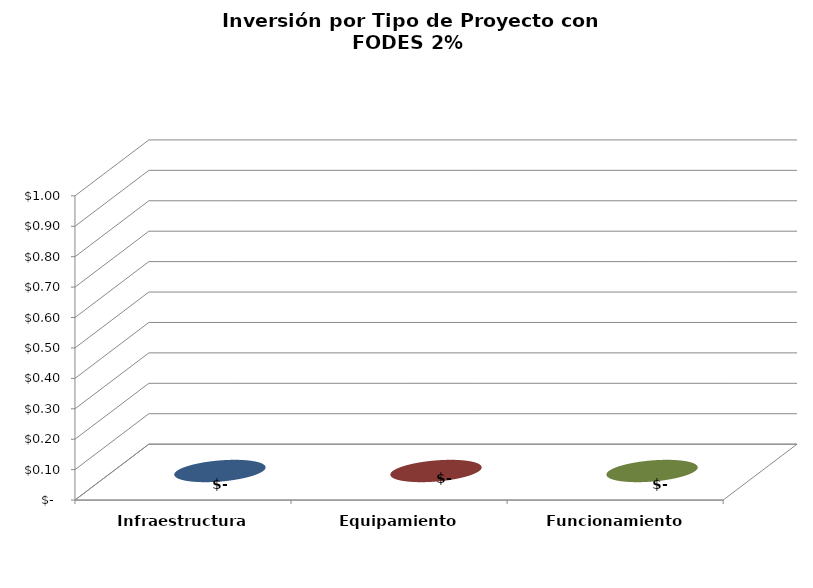
| Category | Series 0 |
|---|---|
| Infraestructura | 0 |
| Equipamiento | 0 |
| Funcionamiento | 0 |